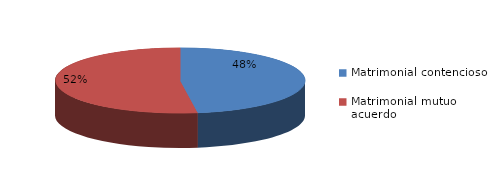
| Category | Series 0 |
|---|---|
| 0 | 1791 |
| 1 | 1959 |